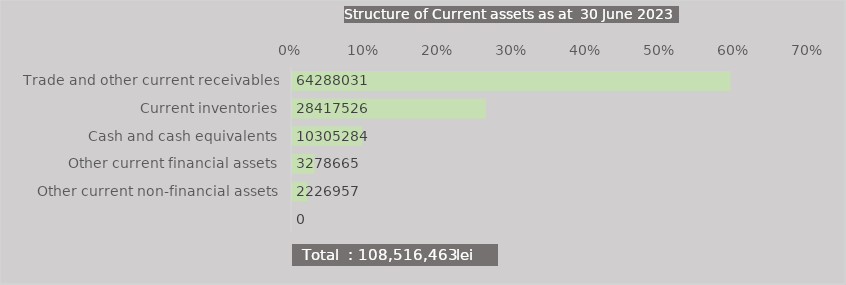
| Category | Series 0 |
|---|---|
| Trade and other current receivables | 0.592 |
| Current inventories | 0.262 |
| Cash and cash equivalents | 0.095 |
| Other current financial assets | 0.03 |
| Other current non-financial assets | 0.021 |